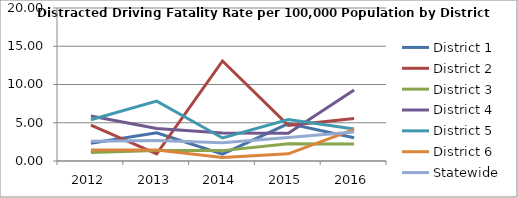
| Category | District 1 | District 2 | District 3 | District 4 | District 5 | District 6 | Statewide |
|---|---|---|---|---|---|---|---|
| 2012.0 | 2.321 | 4.695 | 1.126 | 5.877 | 5.397 | 1.432 | 2.569 |
| 2013.0 | 3.677 | 0.938 | 1.384 | 4.236 | 7.825 | 1.425 | 2.667 |
| 2014.0 | 0.903 | 13.08 | 1.357 | 3.675 | 3.008 | 0.471 | 2.386 |
| 2015.0 | 4.889 | 4.656 | 2.268 | 3.638 | 5.408 | 0.934 | 3.082 |
| 2016.0 | 3.043 | 5.552 | 2.222 | 9.281 | 4.171 | 4.125 | 3.802 |